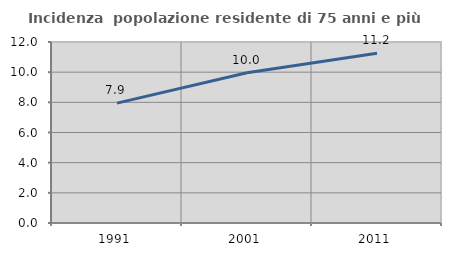
| Category | Incidenza  popolazione residente di 75 anni e più |
|---|---|
| 1991.0 | 7.949 |
| 2001.0 | 9.967 |
| 2011.0 | 11.248 |